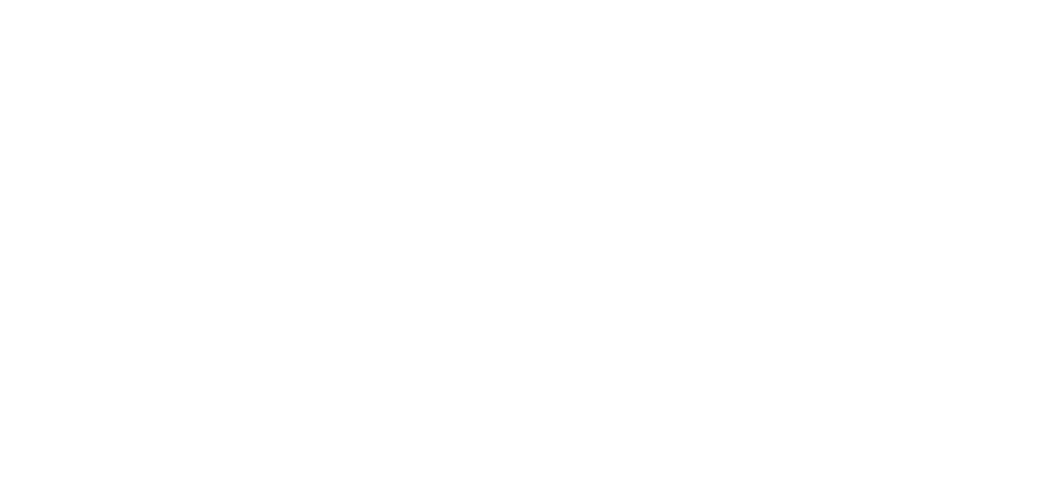
| Category | Total |
|---|---|
| Al Hodeidah | 608 |
| Hajjah | 496 |
| Marib | 218 |
| Taiz | 196 |
| Al Jawf | 166 |
| Amran | 150 |
| Ad Dali | 97 |
| Lahj | 69 |
| Abyan | 67 |
| Sanaa | 52 |
| Ibb | 45 |
| Sadah | 44 |
| Al Bayda | 37 |
| Aden | 32 |
| Hadramawt | 22 |
| Dhamar | 22 |
| Shabwah | 17 |
| Al Maharah | 15 |
| Raymah | 8 |
| Al Mahwit | 8 |
| Sanaa City | 4 |
| Socotra | 1 |